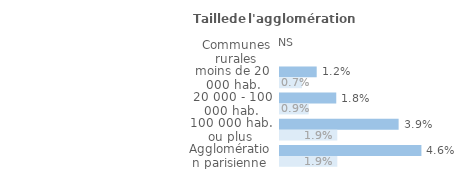
| Category | Series 1 | Series 0 |
|---|---|---|
| Communes rurales | 0 | 0 |
| moins de 20 000 hab. | 0.012 | 0.007 |
| 20 000 - 100 000 hab. | 0.018 | 0.009 |
| 100 000 hab. ou plus | 0.039 | 0.019 |
| Agglomération parisienne | 0.046 | 0.019 |